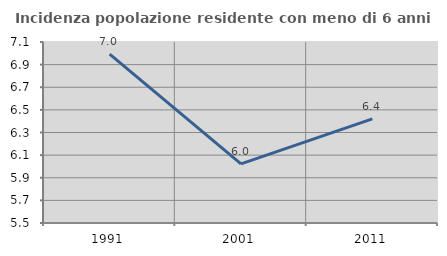
| Category | Incidenza popolazione residente con meno di 6 anni |
|---|---|
| 1991.0 | 6.993 |
| 2001.0 | 6.023 |
| 2011.0 | 6.421 |